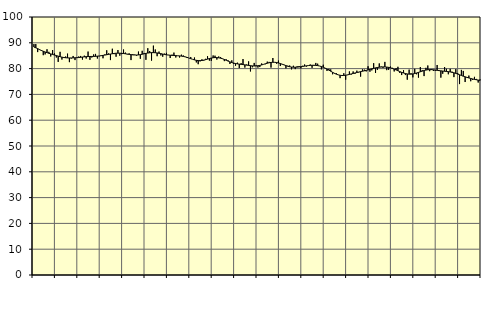
| Category | Piggar | Series 1 |
|---|---|---|
| nan | 89.5 | 88.35 |
| 1.0 | 89.5 | 88.06 |
| 1.0 | 86.4 | 87.75 |
| 1.0 | 87.5 | 87.35 |
| 1.0 | 87.2 | 87.02 |
| 1.0 | 85.2 | 86.72 |
| 1.0 | 85.5 | 86.44 |
| 1.0 | 87.5 | 86.19 |
| 1.0 | 86.5 | 85.93 |
| 1.0 | 84.7 | 85.7 |
| 1.0 | 87.2 | 85.48 |
| 1.0 | 85.9 | 85.26 |
| nan | 84.3 | 85.05 |
| 2.0 | 82.6 | 84.83 |
| 2.0 | 86.5 | 84.62 |
| 2.0 | 83.5 | 84.44 |
| 2.0 | 84.1 | 84.3 |
| 2.0 | 84.7 | 84.21 |
| 2.0 | 85.8 | 84.15 |
| 2.0 | 82.5 | 84.13 |
| 2.0 | 83.9 | 84.13 |
| 2.0 | 84.9 | 84.16 |
| 2.0 | 83.3 | 84.19 |
| 2.0 | 84.3 | 84.23 |
| nan | 84.7 | 84.29 |
| 3.0 | 84.9 | 84.37 |
| 3.0 | 83.5 | 84.47 |
| 3.0 | 85 | 84.56 |
| 3.0 | 83.9 | 84.63 |
| 3.0 | 86.6 | 84.67 |
| 3.0 | 83.4 | 84.69 |
| 3.0 | 84.3 | 84.71 |
| 3.0 | 85.5 | 84.73 |
| 3.0 | 85.7 | 84.76 |
| 3.0 | 83.9 | 84.82 |
| 3.0 | 84.8 | 84.9 |
| nan | 84.9 | 85 |
| 4.0 | 84 | 85.12 |
| 4.0 | 85.5 | 85.25 |
| 4.0 | 87.1 | 85.38 |
| 4.0 | 85.9 | 85.51 |
| 4.0 | 83.3 | 85.64 |
| 4.0 | 87.7 | 85.76 |
| 4.0 | 85.6 | 85.87 |
| 4.0 | 84.6 | 85.95 |
| 4.0 | 87.2 | 85.98 |
| 4.0 | 85 | 85.97 |
| 4.0 | 85.6 | 85.92 |
| nan | 87.4 | 85.84 |
| 5.0 | 86.2 | 85.74 |
| 5.0 | 85.5 | 85.63 |
| 5.0 | 85.9 | 85.51 |
| 5.0 | 83.3 | 85.4 |
| 5.0 | 85.6 | 85.31 |
| 5.0 | 85.4 | 85.27 |
| 5.0 | 85 | 85.26 |
| 5.0 | 86.6 | 85.31 |
| 5.0 | 83.8 | 85.41 |
| 5.0 | 86.9 | 85.56 |
| 5.0 | 86 | 85.74 |
| nan | 83.4 | 85.9 |
| 6.0 | 87.9 | 86.04 |
| 6.0 | 86.8 | 86.13 |
| 6.0 | 83.1 | 86.19 |
| 6.0 | 88.9 | 86.19 |
| 6.0 | 87.4 | 86.15 |
| 6.0 | 84.8 | 86.07 |
| 6.0 | 86.6 | 85.94 |
| 6.0 | 85.1 | 85.8 |
| 6.0 | 84.6 | 85.64 |
| 6.0 | 85.8 | 85.49 |
| 6.0 | 86.1 | 85.35 |
| nan | 85.3 | 85.25 |
| 7.0 | 84.1 | 85.18 |
| 7.0 | 85.4 | 85.12 |
| 7.0 | 86.2 | 85.08 |
| 7.0 | 84.3 | 85.04 |
| 7.0 | 85 | 84.98 |
| 7.0 | 84.3 | 84.92 |
| 7.0 | 85.4 | 84.84 |
| 7.0 | 85.1 | 84.72 |
| 7.0 | 84.5 | 84.56 |
| 7.0 | 84.1 | 84.35 |
| 7.0 | 84.1 | 84.1 |
| nan | 84.5 | 83.84 |
| 8.0 | 83.6 | 83.6 |
| 8.0 | 84.3 | 83.38 |
| 8.0 | 82.4 | 83.21 |
| 8.0 | 81.7 | 83.11 |
| 8.0 | 82.8 | 83.09 |
| 8.0 | 83.6 | 83.15 |
| 8.0 | 83.1 | 83.29 |
| 8.0 | 83.8 | 83.47 |
| 8.0 | 84.8 | 83.68 |
| 8.0 | 83.1 | 83.9 |
| 8.0 | 83 | 84.08 |
| nan | 85.1 | 84.21 |
| 9.0 | 85 | 84.28 |
| 9.0 | 83.5 | 84.26 |
| 9.0 | 84.7 | 84.18 |
| 9.0 | 84.5 | 84.04 |
| 9.0 | 83.9 | 83.82 |
| 9.0 | 82.9 | 83.55 |
| 9.0 | 83.6 | 83.24 |
| 9.0 | 83.2 | 82.91 |
| 9.0 | 81.8 | 82.6 |
| 9.0 | 83.2 | 82.34 |
| 9.0 | 81.8 | 82.13 |
| nan | 81.1 | 81.96 |
| 10.0 | 82.3 | 81.83 |
| 10.0 | 80.2 | 81.73 |
| 10.0 | 82.1 | 81.64 |
| 10.0 | 83.7 | 81.55 |
| 10.0 | 80.4 | 81.45 |
| 10.0 | 81.6 | 81.34 |
| 10.0 | 82.8 | 81.23 |
| 10.0 | 78.9 | 81.13 |
| 10.0 | 80.5 | 81.05 |
| 10.0 | 82.2 | 81.01 |
| 10.0 | 81.3 | 81.03 |
| nan | 80.4 | 81.1 |
| 11.0 | 80.6 | 81.24 |
| 11.0 | 82 | 81.42 |
| 11.0 | 81.6 | 81.64 |
| 11.0 | 81.7 | 81.87 |
| 11.0 | 82.7 | 82.08 |
| 11.0 | 82.6 | 82.26 |
| 11.0 | 80.4 | 82.39 |
| 11.0 | 84.1 | 82.45 |
| 11.0 | 82.4 | 82.44 |
| 11.0 | 81.9 | 82.36 |
| 11.0 | 83.1 | 82.19 |
| nan | 81 | 81.97 |
| 12.0 | 81.6 | 81.71 |
| 12.0 | 81.5 | 81.43 |
| 12.0 | 80.1 | 81.16 |
| 12.0 | 81.1 | 80.91 |
| 12.0 | 81.2 | 80.72 |
| 12.0 | 79.7 | 80.59 |
| 12.0 | 81.1 | 80.53 |
| 12.0 | 79.8 | 80.53 |
| 12.0 | 80.9 | 80.57 |
| 12.0 | 81 | 80.64 |
| 12.0 | 80.1 | 80.74 |
| nan | 81.1 | 80.85 |
| 13.0 | 81.6 | 80.96 |
| 13.0 | 80.8 | 81.07 |
| 13.0 | 81.1 | 81.17 |
| 13.0 | 81.6 | 81.25 |
| 13.0 | 80.3 | 81.29 |
| 13.0 | 81.1 | 81.3 |
| 13.0 | 82.2 | 81.25 |
| 13.0 | 81.9 | 81.16 |
| 13.0 | 81 | 81.01 |
| 13.0 | 79.7 | 80.79 |
| 13.0 | 81.5 | 80.52 |
| nan | 80.1 | 80.19 |
| 14.0 | 79.1 | 79.82 |
| 14.0 | 79.9 | 79.41 |
| 14.0 | 79.7 | 78.98 |
| 14.0 | 77.8 | 78.56 |
| 14.0 | 78.3 | 78.17 |
| 14.0 | 78.2 | 77.84 |
| 14.0 | 77.6 | 77.58 |
| 14.0 | 76.3 | 77.41 |
| 14.0 | 77.5 | 77.33 |
| 14.0 | 78.2 | 77.34 |
| 14.0 | 75.7 | 77.43 |
| nan | 77.5 | 77.57 |
| 15.0 | 78.9 | 77.74 |
| 15.0 | 77.7 | 77.93 |
| 15.0 | 78.9 | 78.12 |
| 15.0 | 78 | 78.3 |
| 15.0 | 79.2 | 78.49 |
| 15.0 | 78.5 | 78.66 |
| 15.0 | 76.9 | 78.83 |
| 15.0 | 79.7 | 78.99 |
| 15.0 | 79.6 | 79.14 |
| 15.0 | 78.9 | 79.31 |
| 15.0 | 80.9 | 79.5 |
| nan | 78.8 | 79.7 |
| 16.0 | 79.3 | 79.91 |
| 16.0 | 82.1 | 80.1 |
| 16.0 | 78.3 | 80.28 |
| 16.0 | 79.5 | 80.43 |
| 16.0 | 82 | 80.53 |
| 16.0 | 80.8 | 80.61 |
| 16.0 | 80.3 | 80.65 |
| 16.0 | 82.6 | 80.65 |
| 16.0 | 79.4 | 80.59 |
| 16.0 | 79.5 | 80.48 |
| 16.0 | 80.8 | 80.31 |
| nan | 80.3 | 80.07 |
| 17.0 | 78.9 | 79.79 |
| 17.0 | 80.2 | 79.48 |
| 17.0 | 80.7 | 79.16 |
| 17.0 | 78.3 | 78.85 |
| 17.0 | 77.5 | 78.55 |
| 17.0 | 79.4 | 78.29 |
| 17.0 | 77.5 | 78.08 |
| 17.0 | 75.7 | 77.93 |
| 17.0 | 79.6 | 77.85 |
| 17.0 | 78.2 | 77.85 |
| 17.0 | 76.6 | 77.93 |
| nan | 79.9 | 78.09 |
| 18.0 | 77.8 | 78.3 |
| 18.0 | 76.5 | 78.52 |
| 18.0 | 80.6 | 78.77 |
| 18.0 | 79.4 | 79.02 |
| 18.0 | 77.1 | 79.25 |
| 18.0 | 80.3 | 79.43 |
| 18.0 | 81.2 | 79.55 |
| 18.0 | 79 | 79.61 |
| 18.0 | 79.8 | 79.6 |
| 18.0 | 79.1 | 79.54 |
| 18.0 | 79.1 | 79.44 |
| nan | 81.4 | 79.32 |
| 19.0 | 79.1 | 79.22 |
| 19.0 | 76.5 | 79.13 |
| 19.0 | 78 | 79.05 |
| 19.0 | 80.6 | 78.97 |
| 19.0 | 79.9 | 78.89 |
| 19.0 | 77.8 | 78.81 |
| 19.0 | 79.9 | 78.7 |
| 19.0 | 78.8 | 78.55 |
| 19.0 | 76.7 | 78.37 |
| 19.0 | 79.8 | 78.14 |
| 19.0 | 78.3 | 77.89 |
| nan | 74 | 77.61 |
| 20.0 | 79.5 | 77.32 |
| 20.0 | 79.1 | 77.05 |
| 20.0 | 74.8 | 76.82 |
| 20.0 | 76.5 | 76.59 |
| 20.0 | 77.3 | 76.37 |
| 20.0 | 75.1 | 76.17 |
| 20.0 | 75.6 | 75.99 |
| 20.0 | 76.8 | 75.82 |
| 20.0 | 76 | 75.68 |
| 20.0 | 74.6 | 75.55 |
| 20.0 | 75.8 | 75.43 |